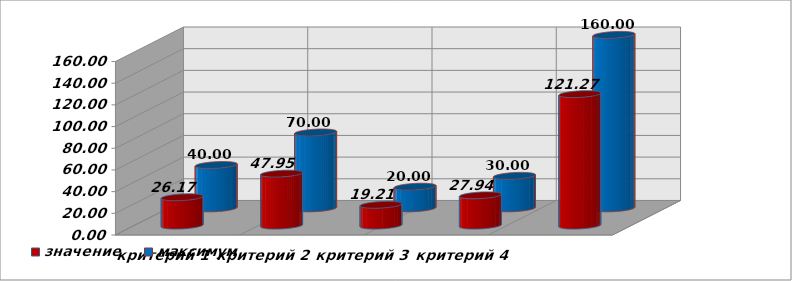
| Category | значение | максимум |
|---|---|---|
| критерий 1 | 26.168 | 40 |
| критерий 2 | 47.954 | 70 |
| критерий 3 | 19.209 | 20 |
| критерий 4 | 27.94 | 30 |